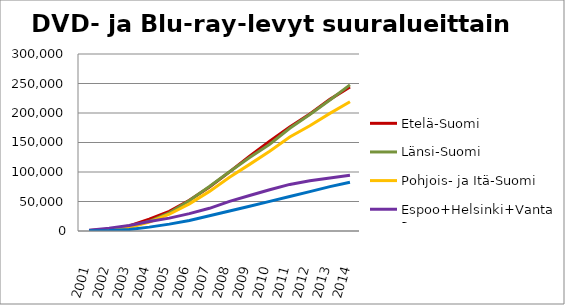
| Category | Etelä-Suomi | Länsi-Suomi | Pohjois- ja Itä-Suomi | Espoo+Helsinki+Vantaa | Muu Uusimaa |
|---|---|---|---|---|---|
| 2001.0 | 914 | 506 | 542 | 1461 | 226 |
| 2002.0 | 2770 | 2169 | 2055 | 4871 | 828 |
| 2003.0 | 8609 | 6349 | 5751 | 9333 | 2622 |
| 2004.0 | 20160 | 16505 | 14955 | 16211 | 6570 |
| 2005.0 | 33276 | 30764 | 28409 | 21848 | 11628 |
| 2006.0 | 51983 | 51649 | 46062 | 29400 | 17899 |
| 2007.0 | 74599 | 75331 | 67132 | 38476 | 25838 |
| 2008.0 | 100190 | 100405 | 90906 | 50163 | 33796 |
| 2009.0 | 127004 | 124616 | 112925 | 60256 | 42023 |
| 2010.0 | 152145 | 146959 | 135210 | 69947 | 50234 |
| 2011.0 | 176228 | 174131 | 159270 | 78965 | 58350 |
| 2012.0 | 198436 | 197554 | 178358 | 85014 | 66762 |
| 2013.0 | 223113 | 222173 | 199315 | 89768 | 75147 |
| 2014.0 | 244199 | 247708 | 218963 | 94477 | 82769 |